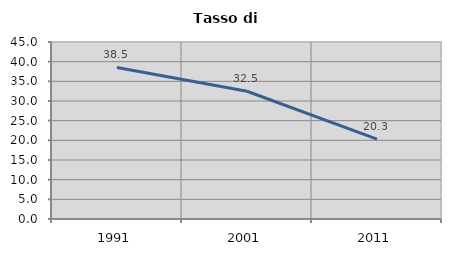
| Category | Tasso di disoccupazione   |
|---|---|
| 1991.0 | 38.534 |
| 2001.0 | 32.478 |
| 2011.0 | 20.313 |